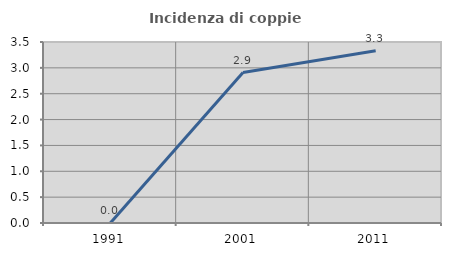
| Category | Incidenza di coppie miste |
|---|---|
| 1991.0 | 0 |
| 2001.0 | 2.91 |
| 2011.0 | 3.329 |